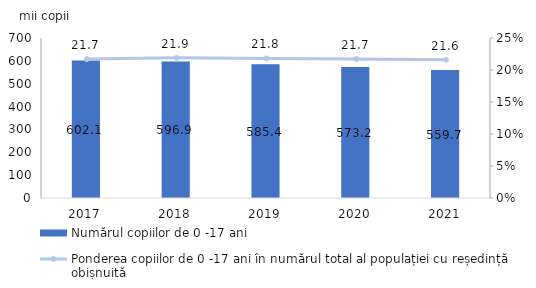
| Category | Numărul copiilor de 0 -17 ani |
|---|---|
| 2017.0 | 602.1 |
| 2018.0 | 596.9 |
| 2019.0 | 585.4 |
| 2020.0 | 573.2 |
| 2021.0 | 559.7 |